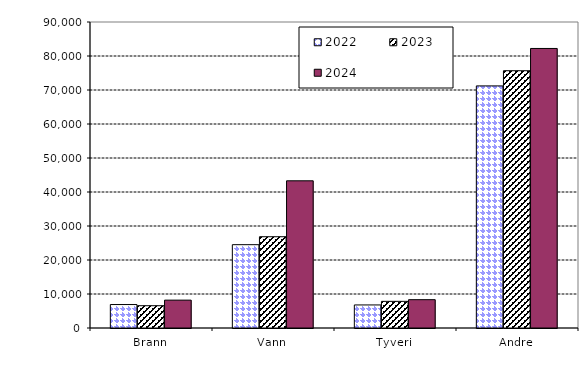
| Category | 2022 | 2023 | 2024 |
|---|---|---|---|
| Brann | 6900.047 | 6557.236 | 8194.415 |
| Vann | 24505.067 | 26844.315 | 43293.22 |
| Tyveri | 6778.644 | 7838.541 | 8331.04 |
| Andre | 71207.252 | 75674.262 | 82218.661 |